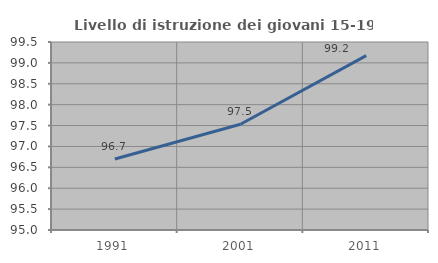
| Category | Livello di istruzione dei giovani 15-19 anni |
|---|---|
| 1991.0 | 96.698 |
| 2001.0 | 97.531 |
| 2011.0 | 99.174 |